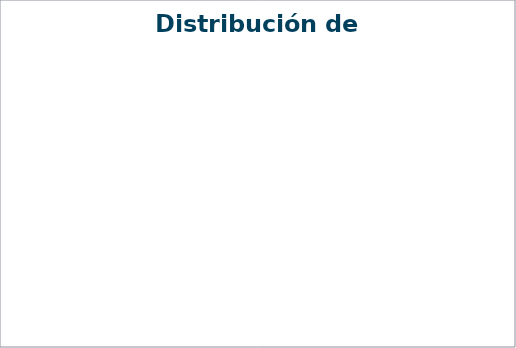
| Category | Importe |
|---|---|
| Gastos financieros | 0 |
| Amortizaciones | 0 |
| Coste de ventas | 0 |
| Costes comerciales | 0 |
| Costes administración | 0 |